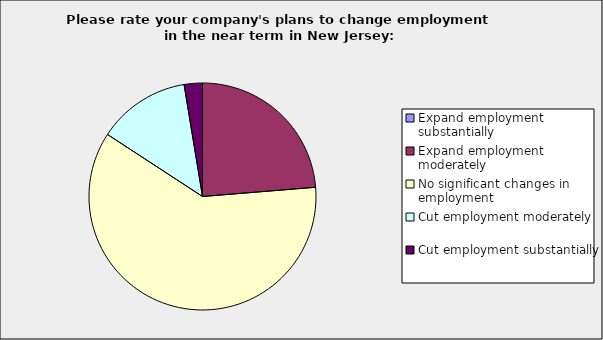
| Category | Series 0 |
|---|---|
| Expand employment substantially | 0 |
| Expand employment moderately | 0.237 |
| No significant changes in employment | 0.605 |
| Cut employment moderately | 0.132 |
| Cut employment substantially | 0.026 |